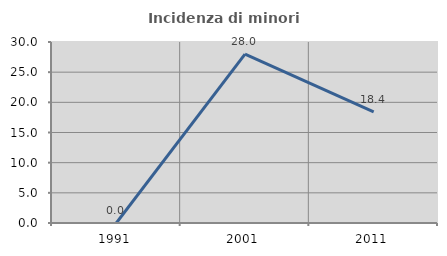
| Category | Incidenza di minori stranieri |
|---|---|
| 1991.0 | 0 |
| 2001.0 | 28 |
| 2011.0 | 18.4 |